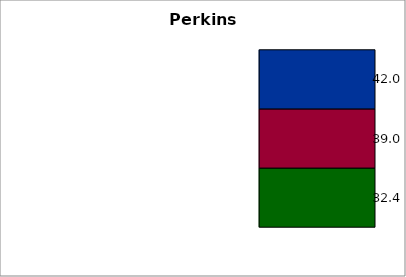
| Category | State | SREB states | 50 states and D.C. |
|---|---|---|---|
| 0 | 32.397 | 39.01 | 41.964 |